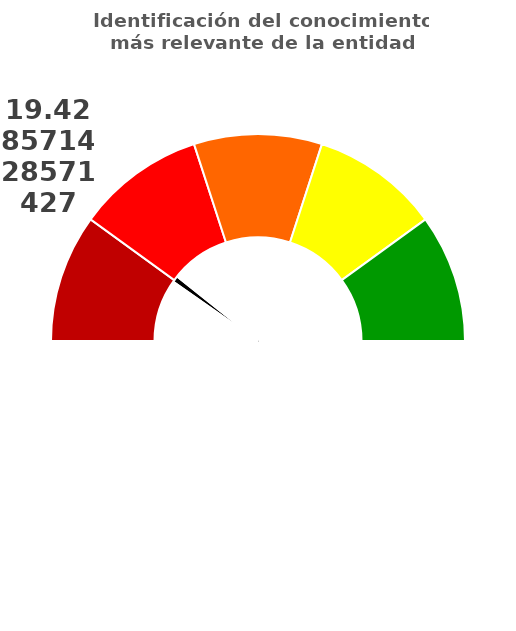
| Category | refe |
|---|---|
| 0 | 19.429 |
| 1 | 2 |
| 2 | 178.571 |